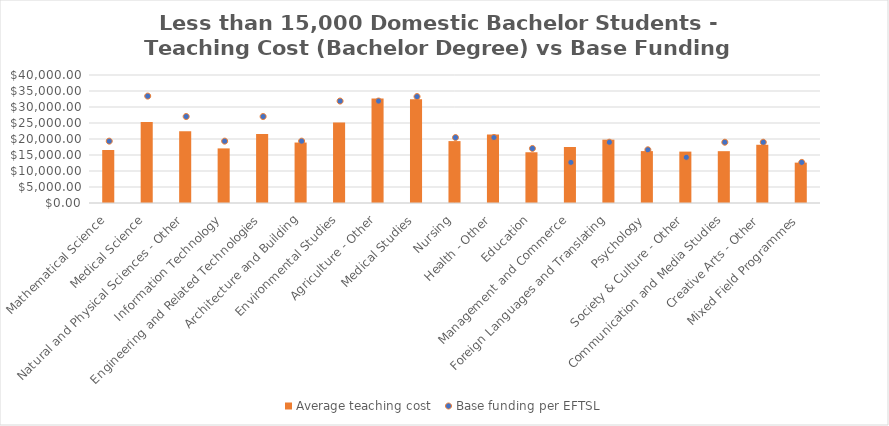
| Category | Average teaching cost  |
|---|---|
| Mathematical Science | 16559.716 |
| Medical Science | 25287.37 |
| Natural and Physical Sciences - Other | 22394.439 |
| Information Technology | 17062.656 |
| Engineering and Related Technologies | 21572.842 |
| Architecture and Building | 18895.856 |
| Environmental Studies | 25185.017 |
| Agriculture - Other | 32649.913 |
| Medical Studies | 32402.522 |
| Nursing | 19344.797 |
| Health - Other | 21384.029 |
| Education | 15859.919 |
| Management and Commerce | 17509.423 |
| Foreign Languages and Translating | 19793.078 |
| Psychology | 16219.039 |
| Society & Culture - Other | 16062.33 |
| Communication and Media Studies | 16193.937 |
| Creative Arts - Other | 18197.364 |
| Mixed Field Programmes | 12618.402 |